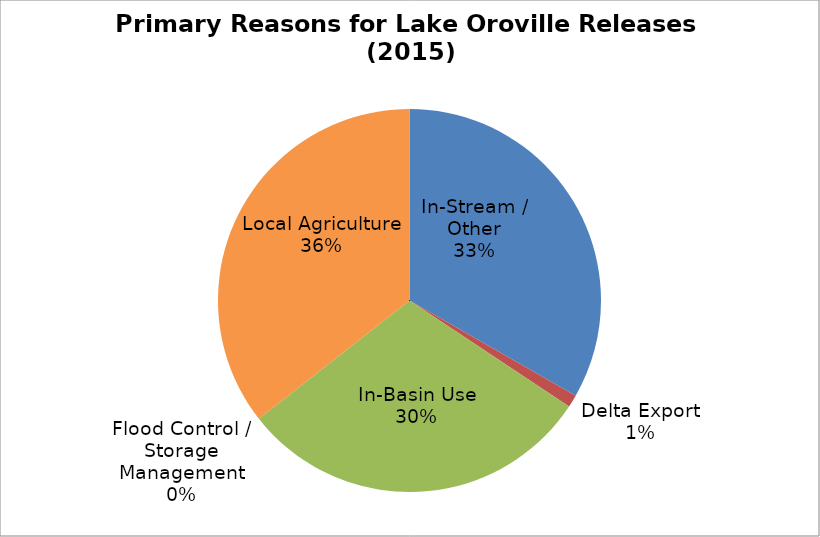
| Category | Series 0 |
|---|---|
| In-Stream / Other | 593.868 |
| Delta Export | 18.759 |
| In-Basin Use | 536.853 |
| Flood Control / Storage Management | 0 |
| Local Agriculture | 635.208 |